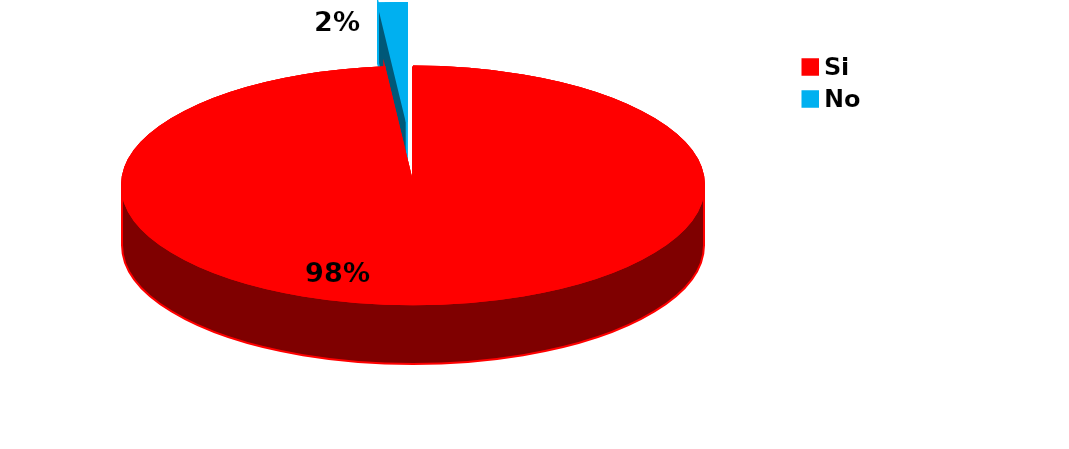
| Category | Series 0 |
|---|---|
| Si | 188 |
| No | 3 |